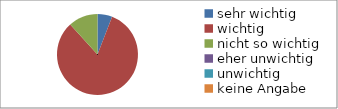
| Category | Series 0 |
|---|---|
| sehr wichtig | 1 |
| wichtig | 14 |
| nicht so wichtig | 2 |
| eher unwichtig | 0 |
| unwichtig | 0 |
| keine Angabe | 0 |